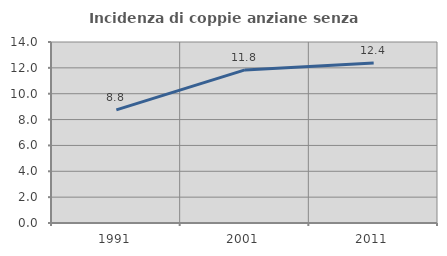
| Category | Incidenza di coppie anziane senza figli  |
|---|---|
| 1991.0 | 8.755 |
| 2001.0 | 11.843 |
| 2011.0 | 12.384 |